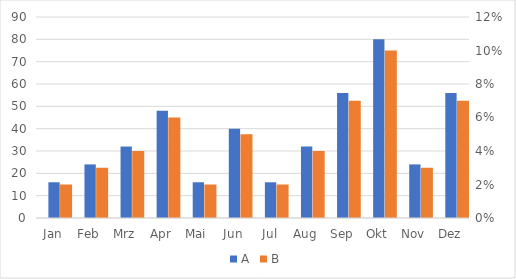
| Category | A |
|---|---|
| Jan | 16 |
| Feb | 24 |
| Mrz | 32 |
| Apr | 48 |
| Mai | 16 |
| Jun | 40 |
| Jul | 16 |
| Aug | 32 |
| Sep | 56 |
| Okt | 80 |
| Nov | 24 |
| Dez | 56 |